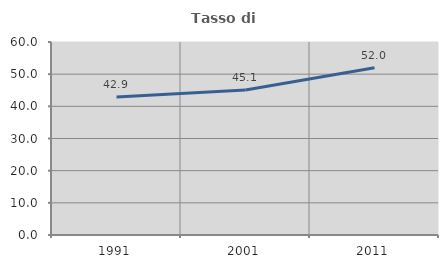
| Category | Tasso di occupazione   |
|---|---|
| 1991.0 | 42.898 |
| 2001.0 | 45.061 |
| 2011.0 | 51.974 |